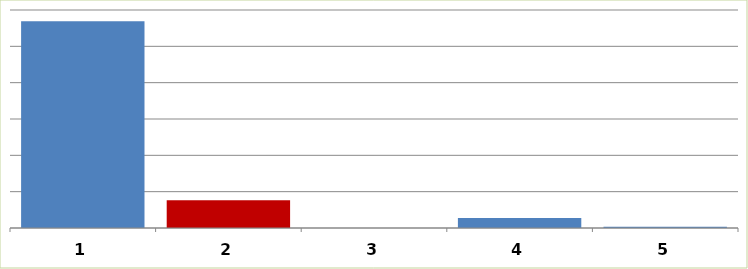
| Category | Series 0 |
|---|---|
| 0 | 28467148.1 |
| 1 | 3830160.35 |
| 2 | 0 |
| 3 | 1369194.75 |
| 4 | 157500 |